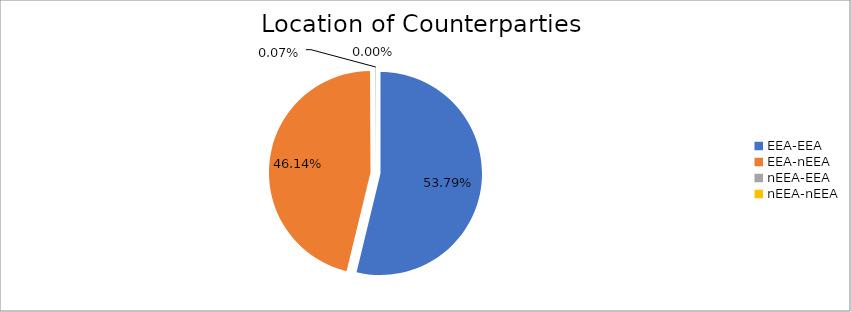
| Category | Series 0 |
|---|---|
| EEA-EEA | 6245625.644 |
| EEA-nEEA | 5356758.765 |
| nEEA-EEA | 8221.761 |
| nEEA-nEEA | 230.638 |